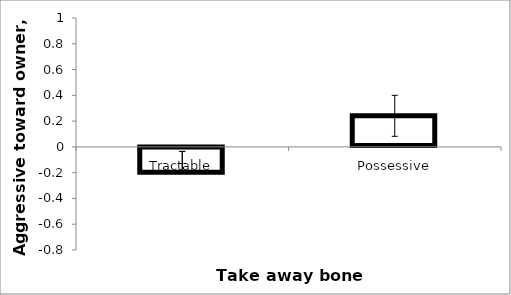
| Category | Series 0 |
|---|---|
| Tractable | -0.209 |
| Possessive | 0.241 |